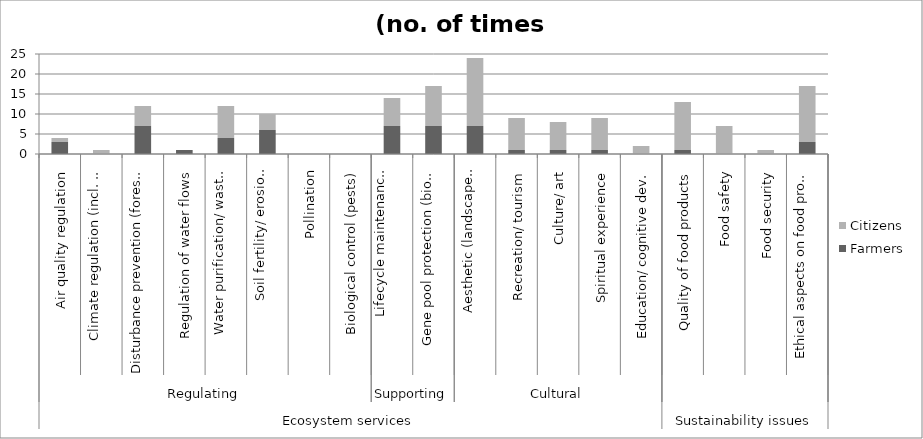
| Category | Farmers | Citizens |
|---|---|---|
| 0 | 3 | 1 |
| 1 | 0 | 1 |
| 2 | 7 | 5 |
| 3 | 1 | 0 |
| 4 | 4 | 8 |
| 5 | 6 | 4 |
| 6 | 0 | 0 |
| 7 | 0 | 0 |
| 8 | 7 | 7 |
| 9 | 7 | 10 |
| 10 | 7 | 17 |
| 11 | 1 | 8 |
| 12 | 1 | 7 |
| 13 | 1 | 8 |
| 14 | 0 | 2 |
| 15 | 1 | 12 |
| 16 | 0 | 7 |
| 17 | 0 | 1 |
| 18 | 3 | 14 |